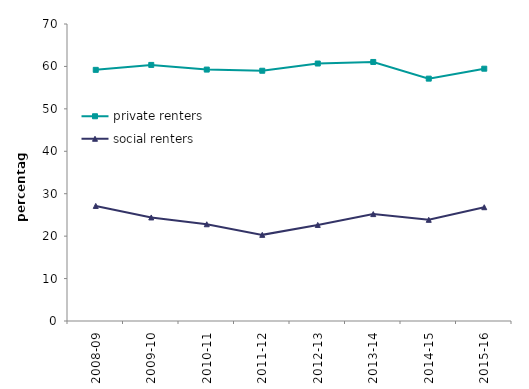
| Category | private renters | social renters |
|---|---|---|
| 2008-09 | 59.194 | 27.122 |
| 2009-10 | 60.358 | 24.405 |
| 2010-11 | 59.257 | 22.801 |
| 2011-12 | 58.984 | 20.303 |
| 2012-13 | 60.686 | 22.644 |
| 2013-14 | 61.052 | 25.196 |
| 2014-15 | 57.123 | 23.846 |
| 2015-16 | 59.464 | 26.818 |